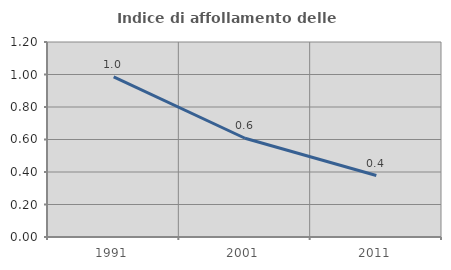
| Category | Indice di affollamento delle abitazioni  |
|---|---|
| 1991.0 | 0.985 |
| 2001.0 | 0.608 |
| 2011.0 | 0.378 |